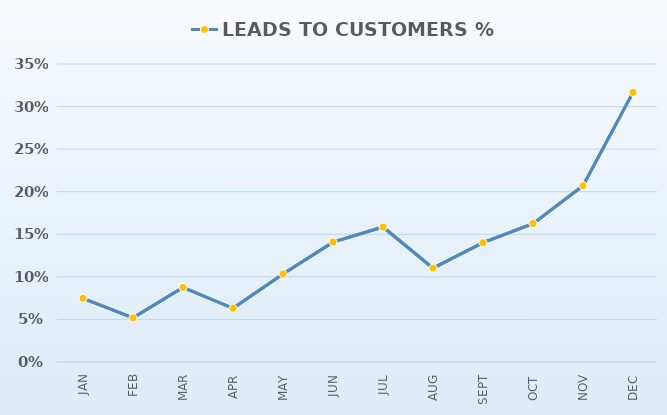
| Category | CONVERSION RATES | LEADS TO CUSTOMERS % |
|---|---|---|
| JAN |  | 0.075 |
| FEB |  | 0.052 |
| MAR |  | 0.088 |
| APR |  | 0.063 |
| MAY |  | 0.103 |
| JUN |  | 0.141 |
| JUL |  | 0.159 |
| AUG |  | 0.11 |
| SEPT |  | 0.14 |
| OCT |  | 0.163 |
| NOV |  | 0.207 |
| DEC |  | 0.317 |